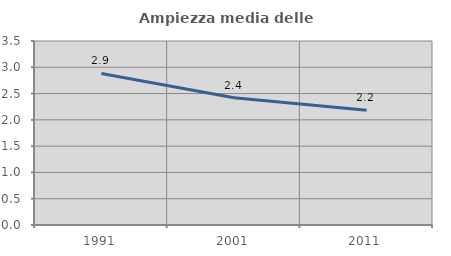
| Category | Ampiezza media delle famiglie |
|---|---|
| 1991.0 | 2.884 |
| 2001.0 | 2.419 |
| 2011.0 | 2.184 |